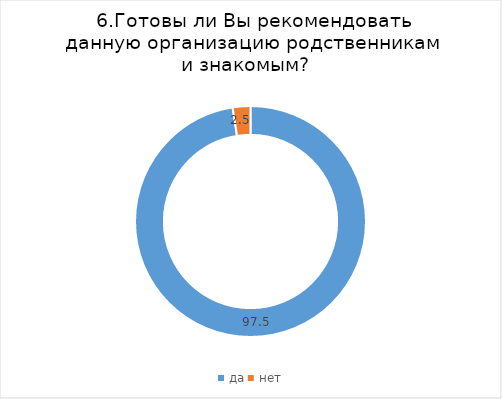
| Category | Series 0 |
|---|---|
| да | 97.517 |
| нет | 2.483 |